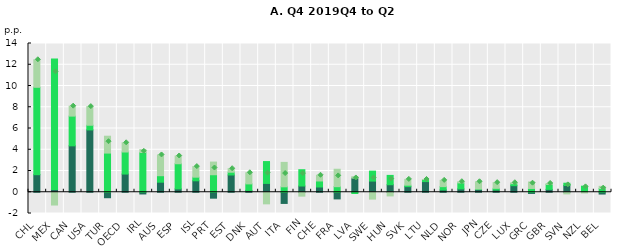
| Category | Unemployment | Marginally attached persons | Other inactivity |
|---|---|---|---|
| CHL | 1.652 | 8.227 | 2.588 |
| MEX | 0.257 | 12.282 | -1.203 |
| CAN | 4.368 | 2.797 | 0.937 |
| USA | 5.865 | 0.442 | 1.753 |
| TUR | -0.515 | 3.687 | 1.587 |
| OECD | 1.712 | 2.076 | 0.865 |
| IRL | -0.162 | 3.744 | 0.265 |
| AUS | 0.945 | 0.612 | 1.954 |
| ESP | 0.314 | 2.369 | 0.729 |
| ISL | 1.078 | 0.341 | 0.996 |
| PRT | -0.558 | 1.648 | 1.192 |
| EST | 1.624 | 0.26 | 0.331 |
| DNK | 0.174 | 0.613 | 1.045 |
| AUT | 0.831 | 2.057 | -1.092 |
| ITA | -1.053 | 0.513 | 2.298 |
| FIN | 0.587 | 1.535 | -0.366 |
| CHE | 0.494 | 0.566 | 0.537 |
| FRA | -0.626 | 0.524 | 1.642 |
| LVA | 1.33 | -0.117 | 0.132 |
| SWE | 1.05 | 0.938 | -0.646 |
| HUN | 0.707 | 0.878 | -0.345 |
| SVK | 0.527 | 0.137 | 0.546 |
| LTU | 1.004 | 0.191 | 0.007 |
| NLD | 0.22 | 0.308 | 0.589 |
| NOR | 0.314 | 0.566 | 0.113 |
| JPN | 0.264 | 0.041 | 0.683 |
| CZE | 0.216 | 0.152 | 0.535 |
| LUX | 0.619 | 0.188 | 0.088 |
| GRC | -0.112 | 0.357 | 0.608 |
| GBR | 0.267 | 0.459 | 0.099 |
| SVN | 0.638 | 0.212 | -0.155 |
| NZL | -0.016 | 0.571 | -0.049 |
| BEL | -0.17 | 0.356 | 0.199 |